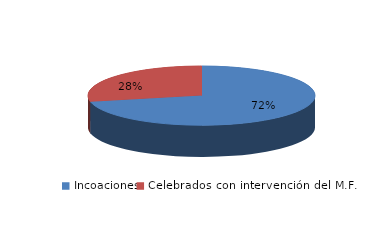
| Category | Series 0 |
|---|---|
| Incoaciones | 505 |
| Celebrados con intervención del M.F. | 200 |